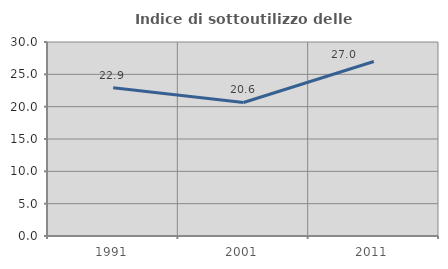
| Category | Indice di sottoutilizzo delle abitazioni  |
|---|---|
| 1991.0 | 22.936 |
| 2001.0 | 20.646 |
| 2011.0 | 26.991 |